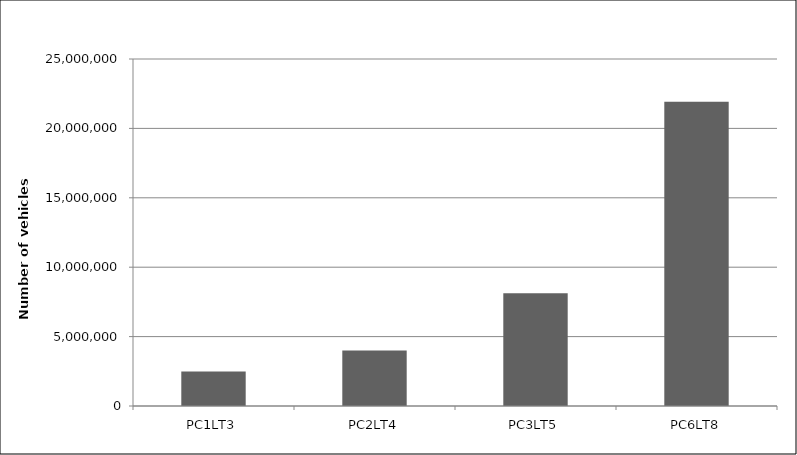
| Category | Number of Vehicles Removed from Fleet Corresponding to Emissions Reductions from Baseline Alternative |
|---|---|
| PC1LT3 | 2481082.569 |
| PC2LT4 | 4006611.369 |
| PC3LT5 | 8125856.421 |
| PC6LT8 | 21921145.984 |